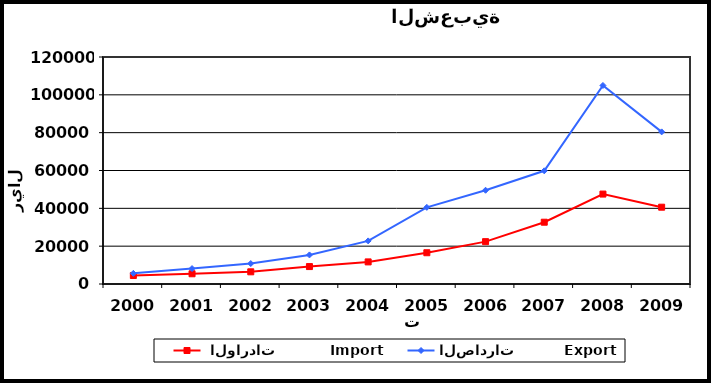
| Category |  الواردات           Import | الصادرات          Export |
|---|---|---|
| 2000.0 | 4485 | 5630 |
| 2001.0 | 5403 | 8159 |
| 2002.0 | 6441 | 10820 |
| 2003.0 | 9211 | 15367 |
| 2004.0 | 11681 | 22787 |
| 2005.0 | 16521 | 40519 |
| 2006.0 | 22391 | 49556 |
| 2007.0 | 32664 | 59840 |
| 2008.0 | 47541 | 104954 |
| 2009.0 | 40601 | 80417 |